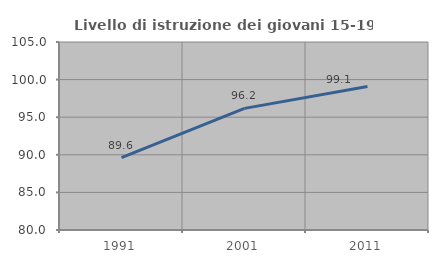
| Category | Livello di istruzione dei giovani 15-19 anni |
|---|---|
| 1991.0 | 89.623 |
| 2001.0 | 96.173 |
| 2011.0 | 99.078 |